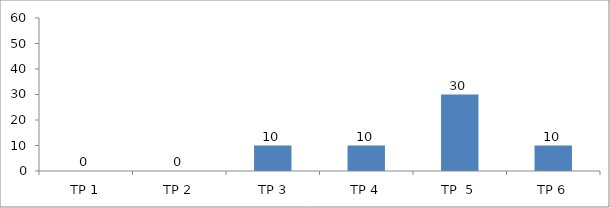
| Category | BIL. MURID |
|---|---|
| TP 1 | 0 |
| TP 2 | 0 |
|  TP 3 | 10 |
| TP 4 | 10 |
| TP  5 | 30 |
| TP 6 | 10 |